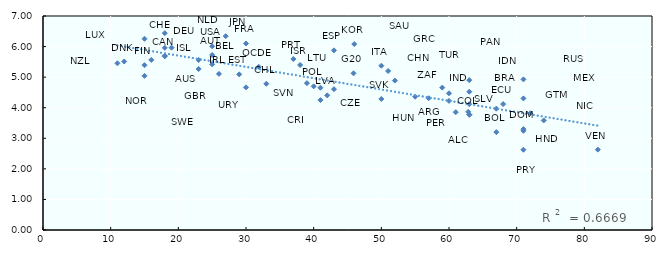
| Category | Qualidade da infraestrutura |
|---|---|
| 82.0 | 2.629 |
| 74.0 | 3.583 |
| 72.0 | 3.818 |
| 71.0 | 3.3 |
| 71.0 | 3.244 |
| 71.0 | 4.304 |
| 71.0 | 2.625 |
| 71.0 | 4.927 |
| 68.0 | 4.118 |
| 67.0 | 3.2 |
| 67.0 | 3.97 |
| 63.0 | 4.114 |
| 63.0 | 3.77 |
| 63.0 | 4.524 |
| 63.0 | 4.901 |
| 63.0 | 3.775 |
| 62.833333333333336 | 3.865 |
| 61.0 | 3.852 |
| 60.0 | 4.223 |
| 60.0 | 4.472 |
| 59.0 | 4.657 |
| 57.0 | 4.31 |
| 55.0 | 4.36 |
| 52.0 | 4.887 |
| 51.0 | 5.202 |
| 50.0 | 5.374 |
| 50.0 | 4.287 |
| 46.0 | 6.082 |
| 45.89473684210526 | 5.125 |
| 43.0 | 4.605 |
| 43.0 | 5.877 |
| 42.0 | 4.403 |
| 41.0 | 4.248 |
| 41.0 | 4.654 |
| 40.0 | 4.699 |
| 39.0 | 4.804 |
| 38.0 | 5.398 |
| 37.0 | 5.593 |
| 33.0 | 4.783 |
| 31.888888888888886 | 5.338 |
| 30.0 | 6.101 |
| 30.0 | 4.665 |
| 29.0 | 5.092 |
| 27.0 | 6.34 |
| 26.0 | 5.106 |
| 25.0 | 5.725 |
| 25.0 | 5.419 |
| 25.0 | 6.01 |
| 23.0 | 5.267 |
| 23.0 | 5.56 |
| 19.0 | 5.964 |
| 18.0 | 5.702 |
| 18.0 | 5.681 |
| 18.0 | 6.438 |
| 18.0 | 5.959 |
| 16.0 | 5.563 |
| 15.0 | 5.391 |
| 15.0 | 5.043 |
| 15.0 | 6.255 |
| 12.0 | 5.511 |
| 11.0 | 5.453 |